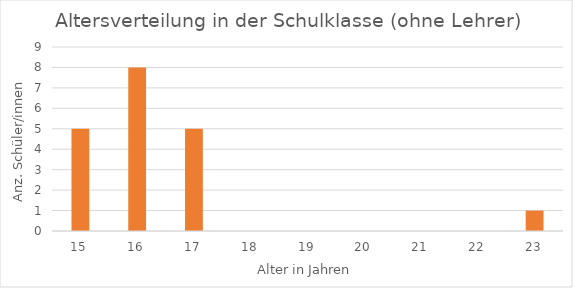
| Category | Anz. Schüler/innen |
|---|---|
| 15.0 | 5 |
| 16.0 | 8 |
| 17.0 | 5 |
| 18.0 | 0 |
| 19.0 | 0 |
| 20.0 | 0 |
| 21.0 | 0 |
| 22.0 | 0 |
| 23.0 | 1 |